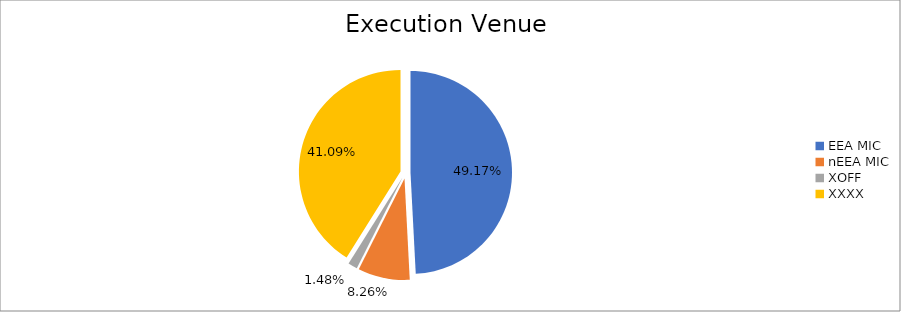
| Category | Series 0 |
|---|---|
| EEA MIC | 6708292.337 |
| nEEA MIC | 1126492.275 |
| XOFF | 202113.094 |
| XXXX | 5605051.413 |